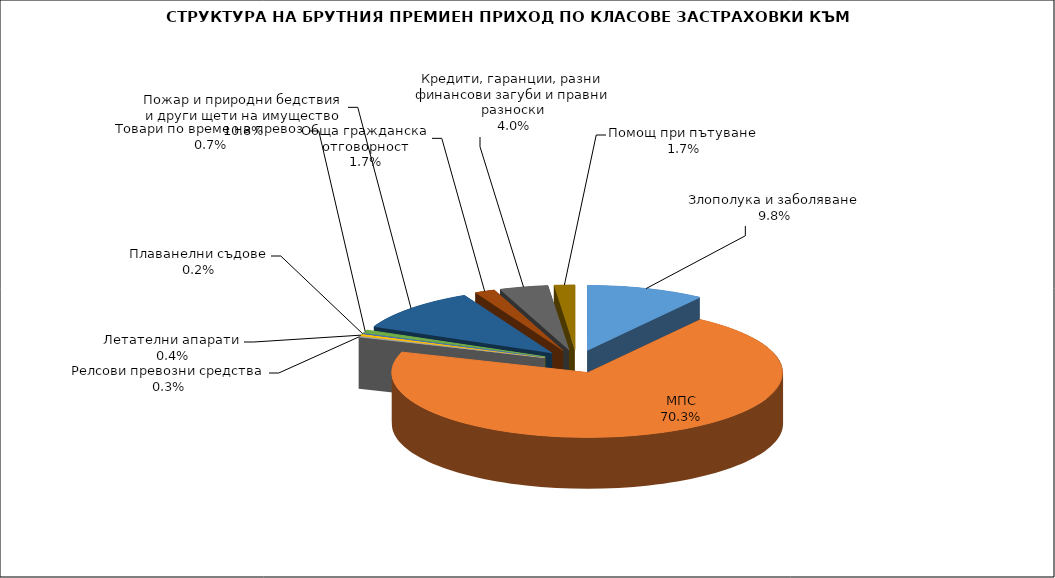
| Category | Злополука и заболяване |
|---|---|
| Злополука и заболяване | 0.098 |
| МПС | 0.703 |
| Релсови превозни средства | 0.003 |
| Летателни апарати | 0.004 |
| Плаванелни съдове | 0.002 |
| Товари по време на превоз | 0.007 |
| Пожар и природни бедствия и други щети на имущество | 0.108 |
| Обща гражданска отговорност | 0.017 |
| Кредити, гаранции, разни финансови загуби и правни разноски | 0.04 |
| Помощ при пътуване | 0.017 |